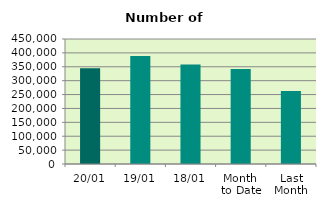
| Category | Series 0 |
|---|---|
| 20/01 | 344938 |
| 19/01 | 389110 |
| 18/01 | 358174 |
| Month 
to Date | 342187.143 |
| Last
Month | 263242 |